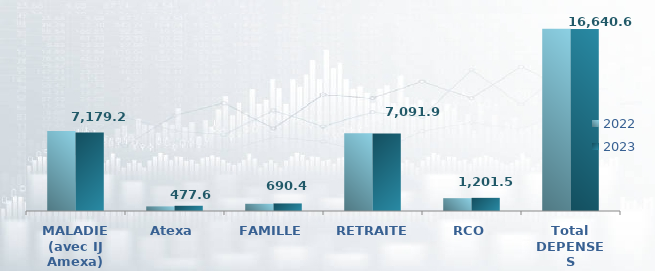
| Category | 2022 | 2023 |
|---|---|---|
| MALADIE (avec IJ Amexa) | 7303.684 | 7179.198 |
| Atexa | 422.342 | 477.644 |
| FAMILLE | 660.464 | 690.398 |
| RETRAITE | 7099.617 | 7091.919 |
| RCO | 1172.716 | 1201.482 |
| Total DEPENSES | 16658.822 | 16640.641 |